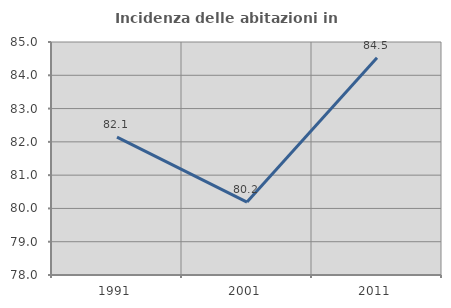
| Category | Incidenza delle abitazioni in proprietà  |
|---|---|
| 1991.0 | 82.143 |
| 2001.0 | 80.191 |
| 2011.0 | 84.527 |